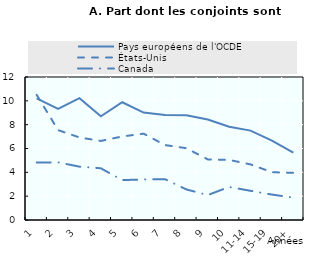
| Category | Pays européens de l'OCDE | États-Unis | Canada |
|---|---|---|---|
| 1 | 10.203 | 10.5 | 4.825 |
| 2 | 9.318 | 7.544 | 4.84 |
| 3 | 10.219 | 6.927 | 4.478 |
| 4 | 8.709 | 6.634 | 4.339 |
| 5 | 9.882 | 7.01 | 3.347 |
| 6 | 9.011 | 7.244 | 3.403 |
| 7 | 8.819 | 6.289 | 3.424 |
| 8 | 8.786 | 6.022 | 2.563 |
| 9 | 8.434 | 5.086 | 2.093 |
| 10 | 7.825 | 5.044 | 2.774 |
| 11-14 | 7.503 | 4.665 | 2.448 |
| 15-19 | 6.667 | 4.011 | 2.134 |
| 20+ | 5.644 | 3.958 | 1.878 |